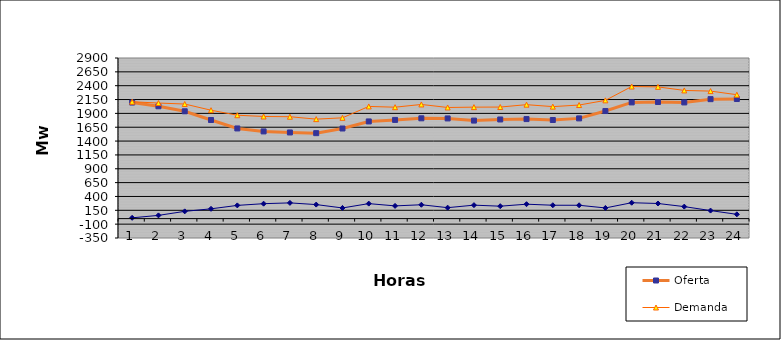
| Category | Oferta | Demanda | No Servida |
|---|---|---|---|
| 1.0 | 2095.7 | 2110.037 | 14.337 |
| 2.0 | 2028.38 | 2086.647 | 58.267 |
| 3.0 | 1937.87 | 2068.908 | 131.038 |
| 4.0 | 1780.18 | 1956.946 | 176.766 |
| 5.0 | 1628.1 | 1866.723 | 238.623 |
| 6.0 | 1574.33 | 1844.12 | 269.79 |
| 7.0 | 1555.66 | 1839.663 | 284.003 |
| 8.0 | 1543.01 | 1796.343 | 253.333 |
| 9.0 | 1627.14 | 1819.929 | 192.789 |
| 10.0 | 1754.74 | 2025.575 | 270.835 |
| 11.0 | 1782.04 | 2011.697 | 229.657 |
| 12.0 | 1811.04 | 2061.236 | 250.196 |
| 13.0 | 1808.93 | 2006.739 | 197.809 |
| 14.0 | 1769.86 | 2012.954 | 243.094 |
| 15.0 | 1790.12 | 2014.393 | 224.273 |
| 16.0 | 1797.19 | 2057.438 | 260.248 |
| 17.0 | 1780.47 | 2021.896 | 241.426 |
| 18.0 | 1809.88 | 2050.68 | 240.8 |
| 19.0 | 1942.3 | 2134.963 | 192.663 |
| 20.0 | 2098.29 | 2385.092 | 286.802 |
| 21.0 | 2105.39 | 2378.534 | 273.144 |
| 22.0 | 2097.92 | 2314.601 | 216.681 |
| 23.0 | 2157.06 | 2302.267 | 145.207 |
| 24.0 | 2159.87 | 2237.12 | 77.25 |